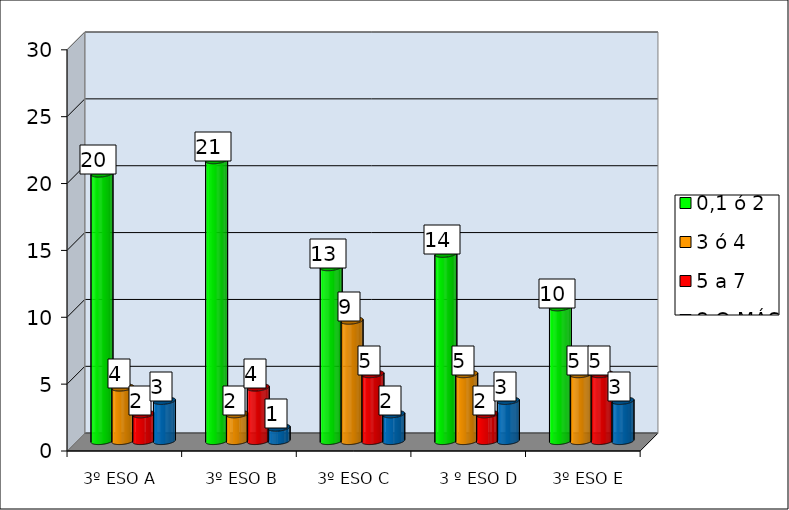
| Category | 0,1 ó 2  | 3 ó 4 | 5 a 7 | 8 O MÁS |
|---|---|---|---|---|
|  | 20 | 4 | 2 | 3 |
|  | 21 | 2 | 4 | 1 |
|  | 13 | 9 | 5 | 2 |
|  | 14 | 5 | 2 | 3 |
|  | 10 | 5 | 5 | 3 |